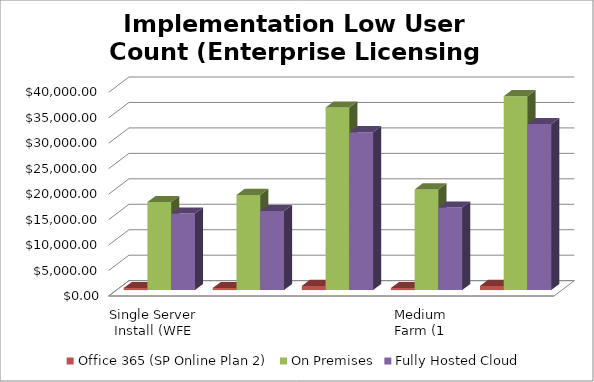
| Category | Office 365 (SP Online Plan 2) | On Premises | Fully Hosted Cloud |
|---|---|---|---|
| Single Server Install (WFE and SQL on 1 VM) | 400 | 17296.269 | 15020 |
| Small Farm - Two Server Install (WFE and SQL) | 400 | 18684.608 | 15510 |
| Small Farm w/ High Availability (2 WFE - 2 SQL) | 800 | 35852.043 | 31025 |
| Medium Farm (1 WFE, 1 App/Index, 1 SQL) | 400 | 19757.455 | 16210 |
| Medium Farm w/ High Availability (2 WFE, 2 A/I, 2 SQL) | 800 | 38071.894 | 32615 |